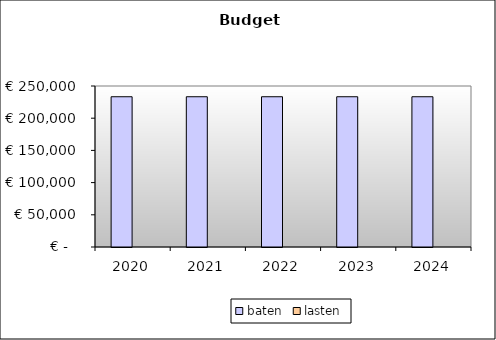
| Category | baten | lasten |
|---|---|---|
| 2020.0 | 233318.15 | 0 |
| 2021.0 | 233318.15 | 0 |
| 2022.0 | 233318.15 | 0 |
| 2023.0 | 233318.15 | 0 |
| 2024.0 | 233318.15 | 0 |